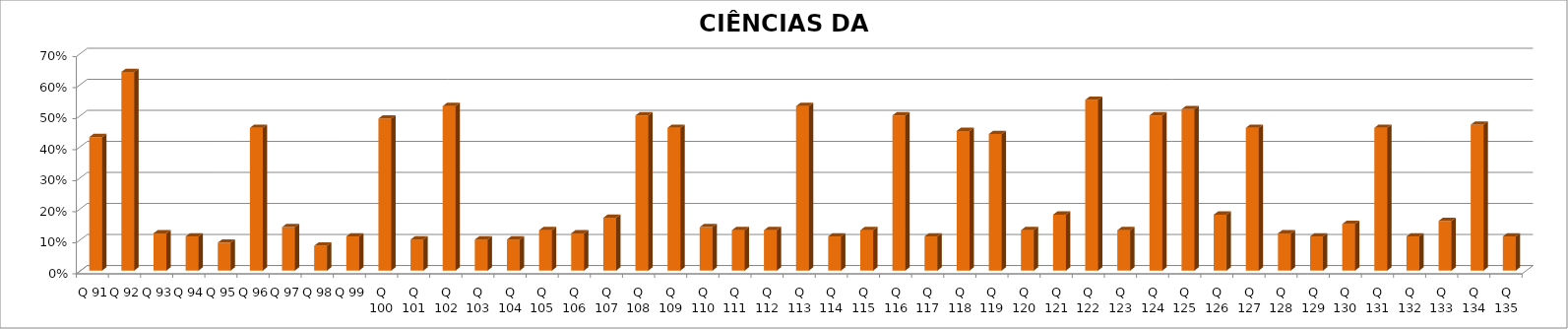
| Category | CIÊNCIAS DA NATUREZA |
|---|---|
| Q 91 | 0.43 |
| Q 92 | 0.64 |
| Q 93 | 0.12 |
| Q 94 | 0.11 |
| Q 95 | 0.09 |
| Q 96 | 0.46 |
| Q 97 | 0.14 |
| Q 98 | 0.08 |
| Q 99 | 0.11 |
| Q 100 | 0.49 |
| Q 101 | 0.1 |
| Q 102 | 0.53 |
| Q 103 | 0.1 |
| Q 104 | 0.1 |
| Q 105 | 0.13 |
| Q 106 | 0.12 |
| Q 107 | 0.17 |
| Q 108 | 0.5 |
| Q 109 | 0.46 |
| Q 110 | 0.14 |
| Q 111 | 0.13 |
| Q 112 | 0.13 |
| Q 113 | 0.53 |
| Q 114 | 0.11 |
| Q 115 | 0.13 |
| Q 116 | 0.5 |
| Q 117 | 0.11 |
| Q 118 | 0.45 |
| Q 119 | 0.44 |
| Q 120 | 0.13 |
| Q 121 | 0.18 |
| Q 122 | 0.55 |
| Q 123 | 0.13 |
| Q 124 | 0.5 |
| Q 125 | 0.52 |
| Q 126 | 0.18 |
| Q 127 | 0.46 |
| Q 128 | 0.12 |
| Q 129 | 0.11 |
| Q 130 | 0.15 |
| Q 131 | 0.46 |
| Q 132 | 0.11 |
| Q 133 | 0.16 |
| Q 134 | 0.47 |
| Q 135 | 0.11 |